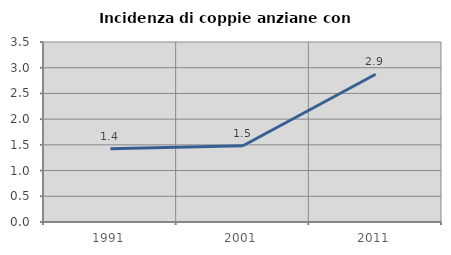
| Category | Incidenza di coppie anziane con figli |
|---|---|
| 1991.0 | 1.423 |
| 2001.0 | 1.484 |
| 2011.0 | 2.872 |